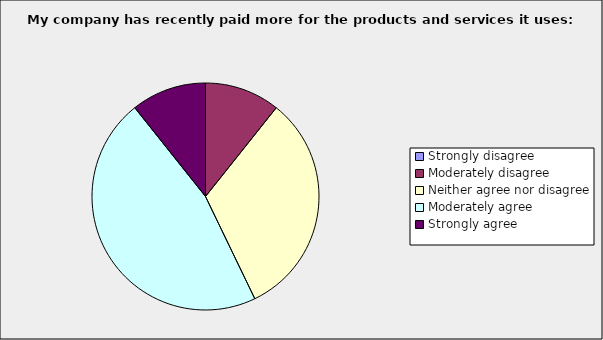
| Category | Series 0 |
|---|---|
| Strongly disagree | 0 |
| Moderately disagree | 0.107 |
| Neither agree nor disagree | 0.321 |
| Moderately agree | 0.464 |
| Strongly agree | 0.107 |